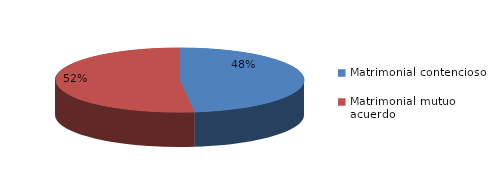
| Category | Series 0 |
|---|---|
| 0 | 102 |
| 1 | 110 |